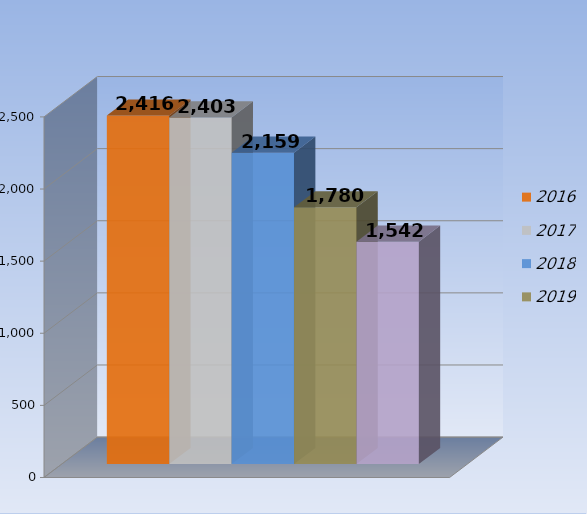
| Category | 2016 | 2017 | 2018 | 2019 | 2020 |
|---|---|---|---|---|---|
| 0 | 2416 | 2403 | 2159 | 1780 | 1542 |